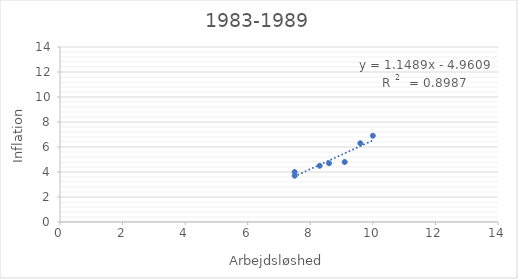
| Category | Series 0 |
|---|---|
| 10.0 | 6.9 |
| 9.6 | 6.3 |
| 8.6 | 4.7 |
| 7.5 | 3.7 |
| 7.5 | 4 |
| 8.3 | 4.5 |
| 9.1 | 4.8 |